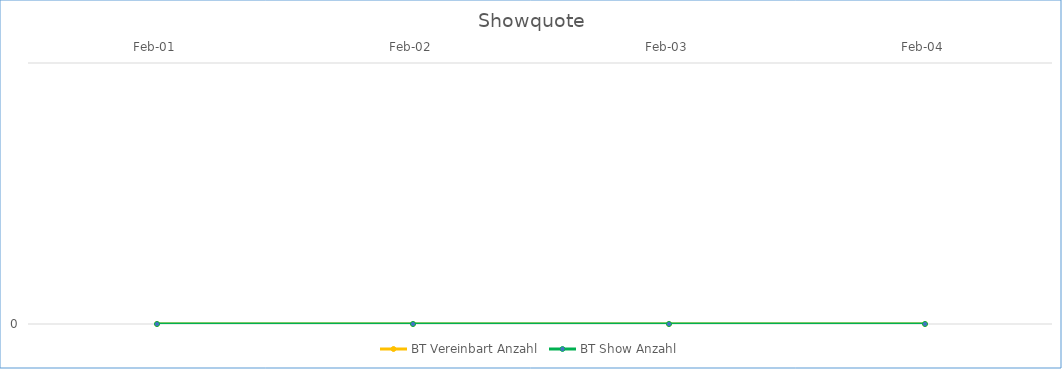
| Category | BT Vereinbart Anzahl | BT Show Anzahl |
|---|---|---|
| 2001-02-01 | 0 | 0 |
| 2002-02-01 | 0 | 0 |
| 2003-02-01 | 0 | 0 |
| 2004-02-01 | 0 | 0 |